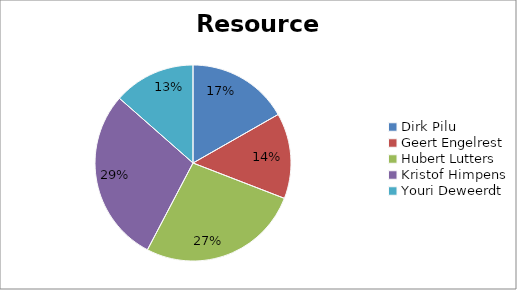
| Category | data |
|---|---|
| Dirk Pilu | 10337.6 |
| Geert Engelrest | 8711.699 |
| Hubert Lutters | 16547.602 |
| Kristof Himpens | 17758.402 |
| Youri Deweerdt | 8343.6 |